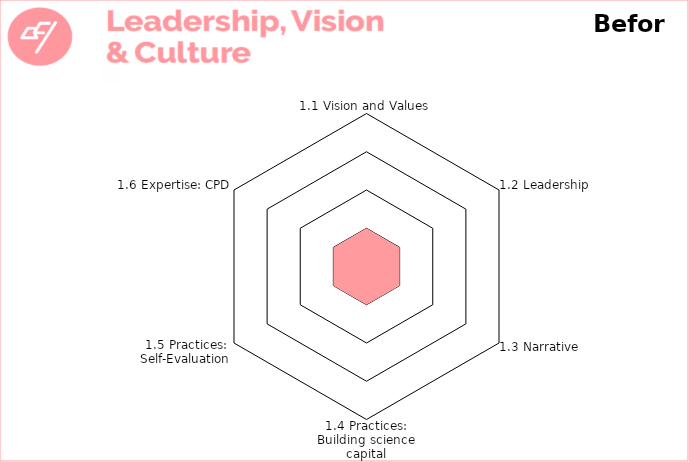
| Category | Theme 1: Leadership, Vision & Culture 

Before |
|---|---|
| 1.1 Vision and Values | 1 |
| 1.2 Leadership | 1 |
| 1.3 Narrative | 1 |
| 1.4 Practices: Building science capital | 1 |
| 1.5 Practices: Self-Evaluation | 1 |
| 1.6 Expertise: CPD | 1 |